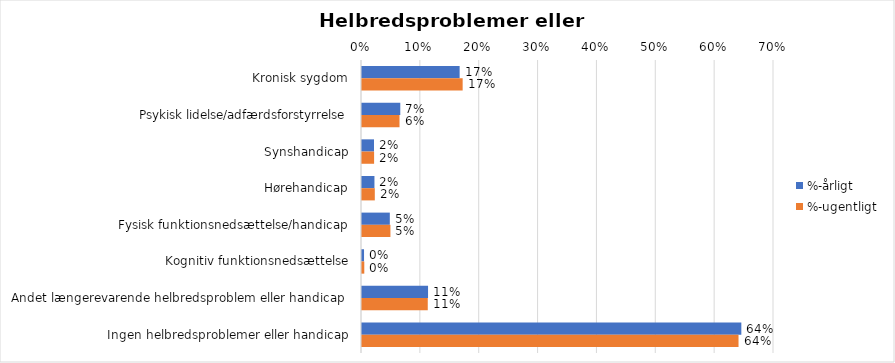
| Category | %-årligt | %-ugentligt |
|---|---|---|
| Kronisk sygdom | 0.166 | 0.171 |
| Psykisk lidelse/adfærdsforstyrrelse | 0.065 | 0.064 |
| Synshandicap | 0.02 | 0.021 |
| Hørehandicap | 0.021 | 0.022 |
| Fysisk funktionsnedsættelse/handicap | 0.047 | 0.048 |
| Kognitiv funktionsnedsættelse | 0.003 | 0.004 |
| Andet længerevarende helbredsproblem eller handicap  | 0.112 | 0.112 |
| Ingen helbredsproblemer eller handicap | 0.645 | 0.64 |